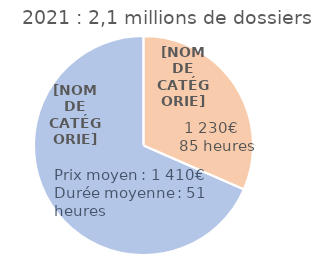
| Category | 2021 |
|---|---|
| Demandeurs d'emploi | 650000 |
| Salariés & autres | 1410000 |